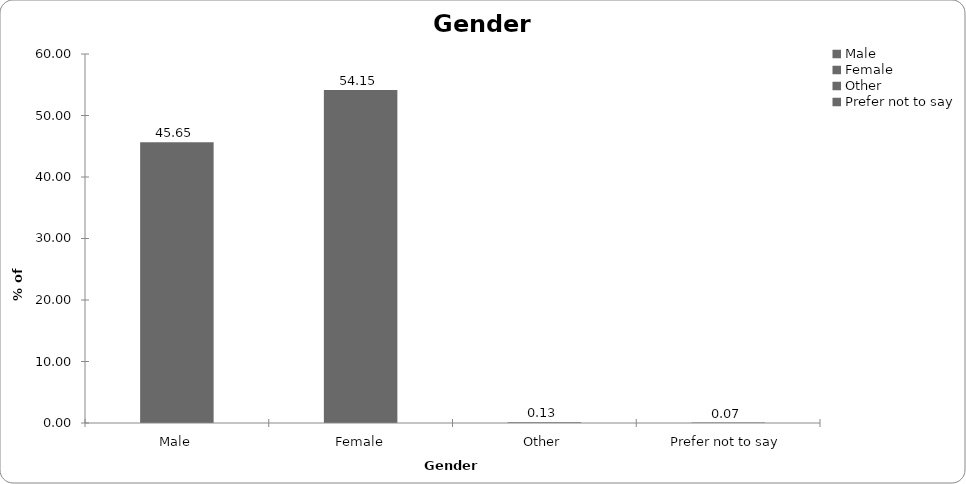
| Category | Series 0 |
|---|---|
| Male | 45.648 |
| Female | 54.153 |
| Other | 0.133 |
| Prefer not to say | 0.066 |